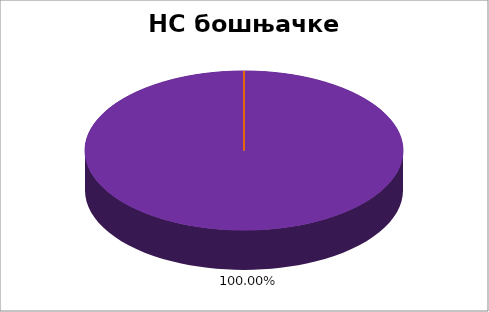
| Category | НС бошњачке НМ |
|---|---|
| 0 | 0 |
| 1 | 0 |
| 2 | 0 |
| 3 | 0 |
| 4 | 1 |